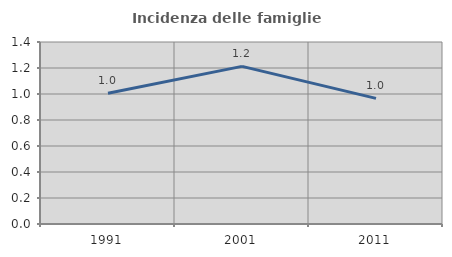
| Category | Incidenza delle famiglie numerose |
|---|---|
| 1991.0 | 1.005 |
| 2001.0 | 1.213 |
| 2011.0 | 0.966 |